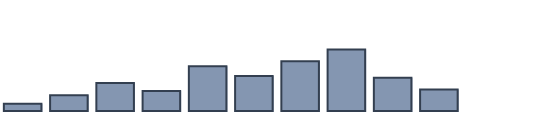
| Category | Series 0 |
|---|---|
| 0 | 2.3 |
| 1 | 5 |
| 2 | 8.8 |
| 3 | 6.3 |
| 4 | 14.1 |
| 5 | 11 |
| 6 | 15.7 |
| 7 | 19.4 |
| 8 | 10.5 |
| 9 | 6.8 |
| 10 | 0 |
| 11 | 0 |